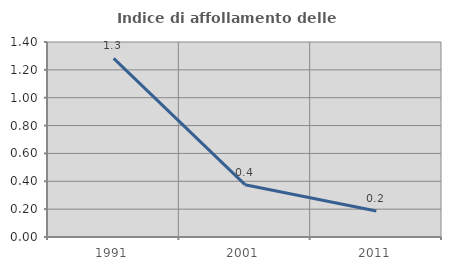
| Category | Indice di affollamento delle abitazioni  |
|---|---|
| 1991.0 | 1.282 |
| 2001.0 | 0.376 |
| 2011.0 | 0.187 |